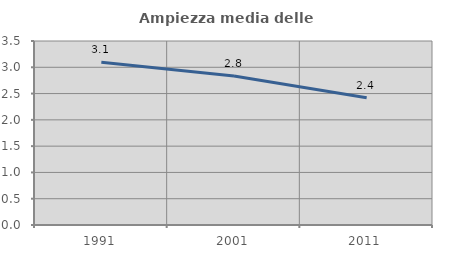
| Category | Ampiezza media delle famiglie |
|---|---|
| 1991.0 | 3.095 |
| 2001.0 | 2.833 |
| 2011.0 | 2.421 |